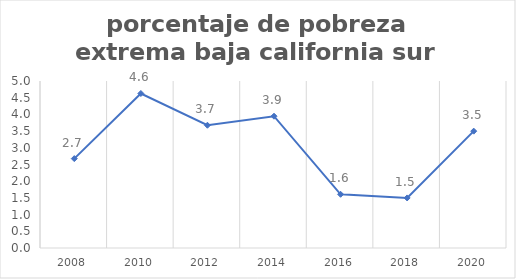
| Category | Series 0 |
|---|---|
| 2008.0 | 2.676 |
| 2010.0 | 4.626 |
| 2012.0 | 3.676 |
| 2014.0 | 3.946 |
| 2016.0 | 1.608 |
| 2018.0 | 1.499 |
| 2020.0 | 3.499 |